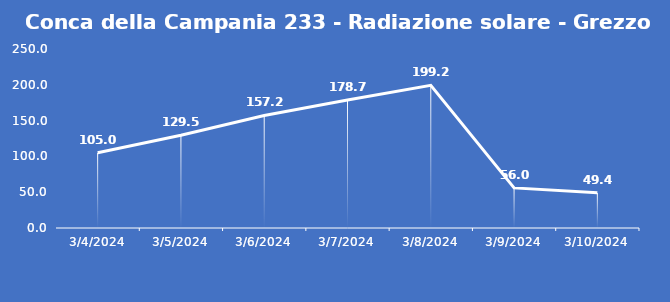
| Category | Conca della Campania 233 - Radiazione solare - Grezzo (W/m2) |
|---|---|
| 3/4/24 | 105 |
| 3/5/24 | 129.5 |
| 3/6/24 | 157.2 |
| 3/7/24 | 178.7 |
| 3/8/24 | 199.2 |
| 3/9/24 | 56 |
| 3/10/24 | 49.4 |